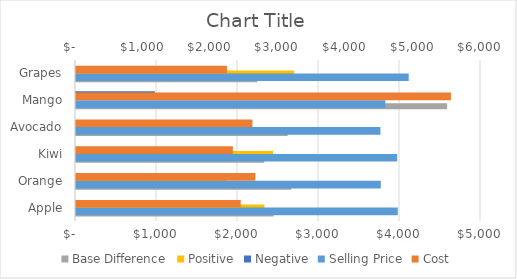
| Category | Base Difference | Positive | Negative |
|---|---|---|---|
| Apple | 2440 | 2327 | 0 |
| Orange | 2657 | 1858 | 0 |
| Kiwi | 2324 | 2434 | 0 |
| Avocado | 2614 | 1896 | 0 |
| Mango | 4582 | 0 | 973 |
| Grapes | 2236 | 2693 | 0 |